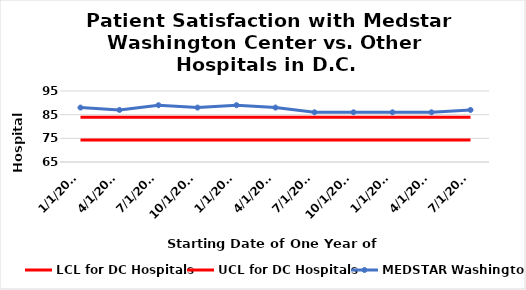
| Category | LCL for DC Hospitals | UCL for DC Hospitals | MEDSTAR Washington |
|---|---|---|---|
| 1/1/2014 | 74.257 | 83.888 | 88 |
| 4/1/2014 | 74.257 | 83.888 | 87 |
| 7/1/2014 | 74.257 | 83.888 | 89 |
| 10/1/2014 | 74.257 | 83.888 | 88 |
| 1/1/2015 | 74.257 | 83.888 | 89 |
| 4/1/2015 | 74.257 | 83.888 | 88 |
| 7/1/2015 | 74.257 | 83.888 | 86 |
| 10/1/2015 | 74.257 | 83.888 | 86 |
| 1/1/2016 | 74.257 | 83.888 | 86 |
|  4/1/2016 | 74.257 | 83.888 | 86 |
|  7/1/2016 | 74.257 | 83.888 | 87 |